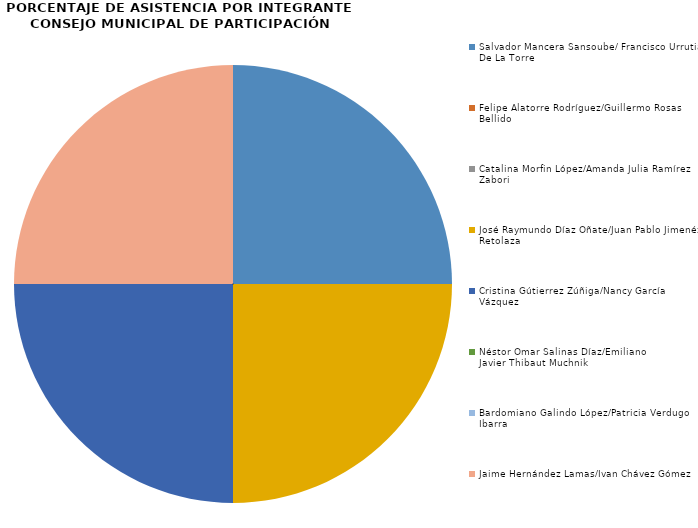
| Category | Series 0 |
|---|---|
| Salvador Mancera Sansoube/ Francisco Urrutia De La Torre | 1 |
| Felipe Alatorre Rodríguez/Guillermo Rosas Bellido | 0 |
| Catalina Morfin López/Amanda Julia Ramírez Zabori | 0 |
| José Raymundo Díaz Oñate/Juan Pablo Jimenéz Retolaza | 1 |
| Cristina Gútierrez Zúñiga/Nancy García Vázquez | 1 |
| Néstor Omar Salinas Díaz/Emiliano Javier Thibaut Muchnik  | 0 |
| Bardomiano Galindo López/Patricia Verdugo Ibarra | 0 |
| Jaime Hernández Lamas/Ivan Chávez Gómez | 1 |